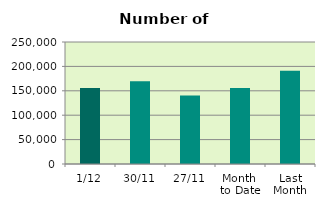
| Category | Series 0 |
|---|---|
| 1/12 | 155812 |
| 30/11 | 169392 |
| 27/11 | 140186 |
| Month 
to Date | 155812 |
| Last
Month | 191084.095 |